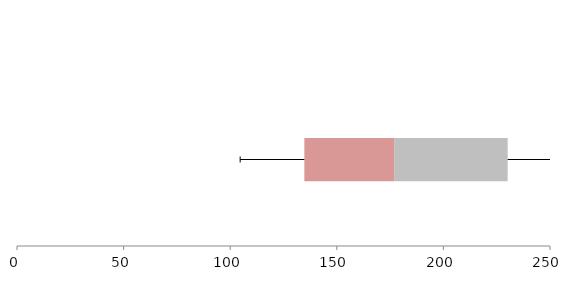
| Category | Series 1 | Series 2 | Series 3 |
|---|---|---|---|
| 0 | 134.78 | 42.105 | 53.258 |